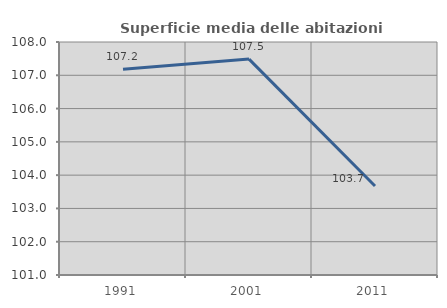
| Category | Superficie media delle abitazioni occupate |
|---|---|
| 1991.0 | 107.184 |
| 2001.0 | 107.486 |
| 2011.0 | 103.674 |